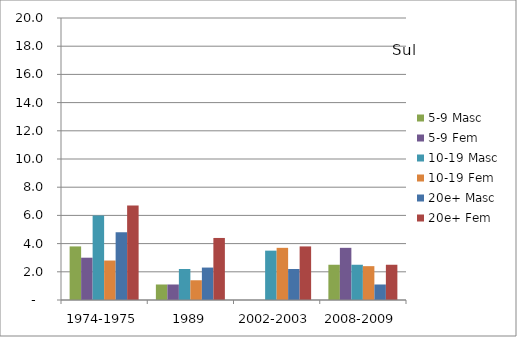
| Category | 5-9 Masc | 5-9 Fem | 10-19 Masc | 10-19 Fem | 20e+ Masc | 20e+ Fem |
|---|---|---|---|---|---|---|
| 1974-1975 | 3.8 | 3 | 6 | 2.8 | 4.8 | 6.7 |
| 1989 | 1.1 | 1.1 | 2.2 | 1.4 | 2.3 | 4.4 |
| 2002-2003 | 0 | 0 | 3.5 | 3.7 | 2.2 | 3.8 |
| 2008-2009 | 2.5 | 3.7 | 2.5 | 2.4 | 1.1 | 2.5 |